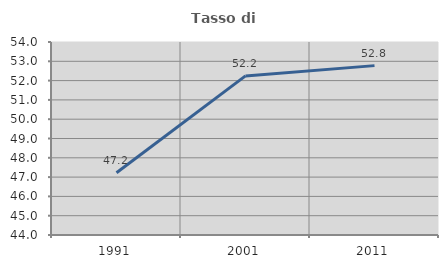
| Category | Tasso di occupazione   |
|---|---|
| 1991.0 | 47.223 |
| 2001.0 | 52.244 |
| 2011.0 | 52.776 |